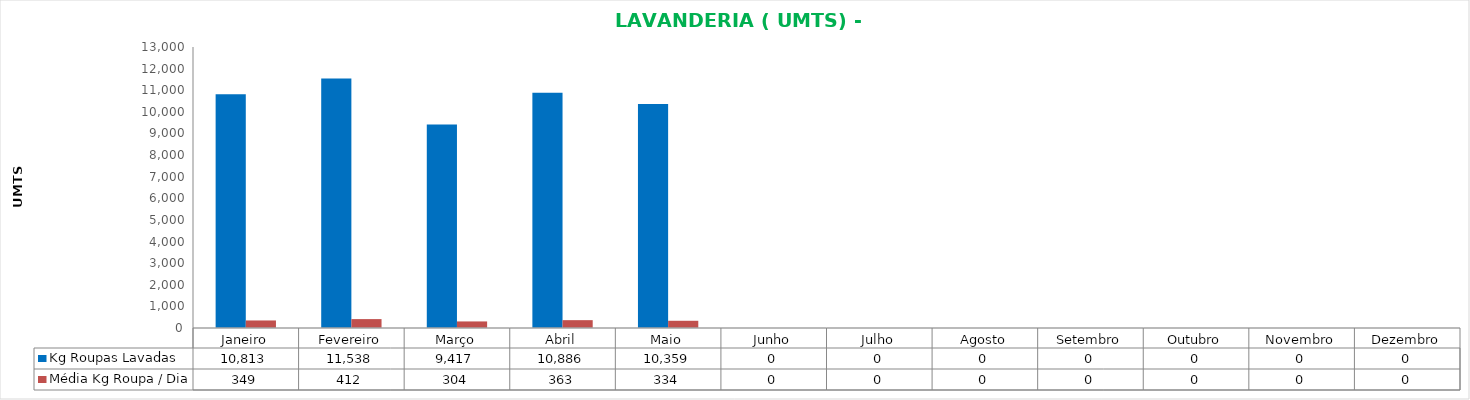
| Category | Kg Roupas Lavadas | Média Kg Roupa / Dia |
|---|---|---|
| Janeiro | 10813 | 348.806 |
| Fevereiro | 11538 | 412.071 |
| Março | 9417 | 303.774 |
| Abril | 10885.6 | 362.853 |
| Maio | 10358.7 | 334.152 |
| Junho | 0 | 0 |
| Julho | 0 | 0 |
| Agosto | 0 | 0 |
| Setembro | 0 | 0 |
| Outubro | 0 | 0 |
| Novembro | 0 | 0 |
| Dezembro | 0 | 0 |